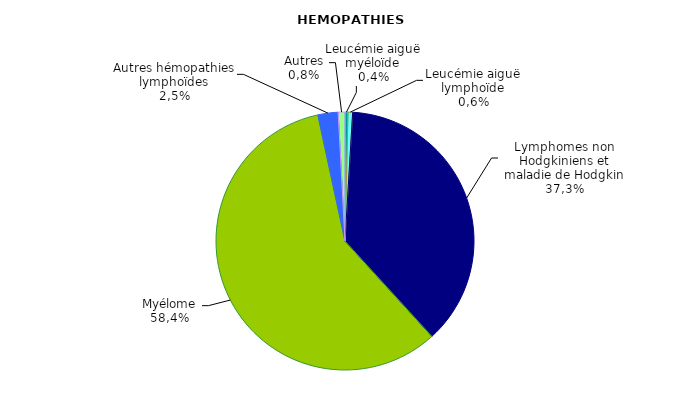
| Category | Nombre | Pourcentage |
|---|---|---|
| Leucémie aiguë myéloïde | 7 | 0.004 |
| Leucémie aiguë lymphoïde | 11 | 0.006 |
| Lymphomes non Hodgkiniens et maladie de Hodgkin | 707 | 0.373 |
| Myélome | 1107 | 0.584 |
| Autres hémopathies lymphoïdes | 48 | 0.025 |
| Autres | 16 | 0.008 |